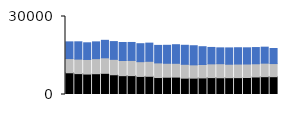
| Category | East Item1 | East Item2 | East Item3 |
|---|---|---|---|
| 0 | 8357 | 5452 | 6439 |
| 1 | 8037 | 5578 | 6652 |
| 2 | 7867 | 5610 | 6407 |
| 3 | 7996 | 5781 | 6467 |
| 4 | 8145 | 5967 | 6728 |
| 5 | 7598 | 5928 | 6824 |
| 6 | 7248 | 5836 | 6912 |
| 7 | 7264 | 5839 | 6913 |
| 8 | 6945 | 5680 | 6914 |
| 9 | 7005 | 5760 | 6994 |
| 10 | 6525 | 5628 | 6731 |
| 11 | 6645 | 5362 | 6916 |
| 12 | 6691 | 5303 | 7157 |
| 13 | 6286 | 5326 | 7315 |
| 14 | 6294 | 5116 | 7350 |
| 15 | 6375 | 5155 | 6854 |
| 16 | 6498 | 5288 | 6314 |
| 17 | 6439 | 5406 | 6099 |
| 18 | 6461 | 5181 | 6279 |
| 19 | 6482 | 5230 | 6275 |
| 20 | 6543 | 5184 | 6230 |
| 21 | 6742 | 5082 | 6232 |
| 22 | 6850 | 5203 | 6152 |
| 23 | 6843 | 5053 | 5790 |